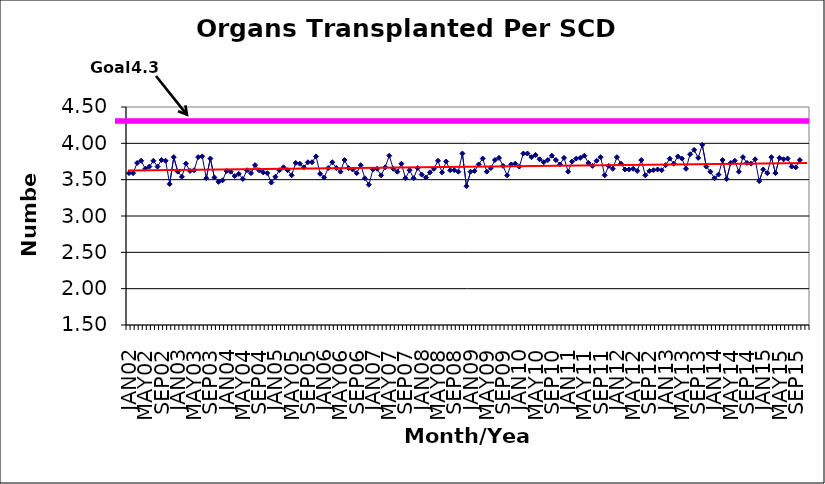
| Category | Series 0 |
|---|---|
| JAN02 | 3.59 |
| FEB02 | 3.59 |
| MAR02 | 3.73 |
| APR02 | 3.76 |
| MAY02 | 3.65 |
| JUN02 | 3.68 |
| JUL02 | 3.76 |
| AUG02 | 3.68 |
| SEP02 | 3.77 |
| OCT02 | 3.76 |
| NOV02 | 3.44 |
| DEC02 | 3.81 |
| JAN03 | 3.61 |
| FEB03 | 3.54 |
| MAR03 | 3.72 |
| APR03 | 3.62 |
| MAY03 | 3.63 |
| JUN03 | 3.81 |
| JUL03 | 3.82 |
| AUG03 | 3.52 |
| SEP03 | 3.79 |
| OCT03 | 3.53 |
| NOV03 | 3.47 |
| DEC03 | 3.49 |
| JAN04 | 3.62 |
| FEB04 | 3.61 |
| MAR04 | 3.55 |
| APR04 | 3.58 |
| MAY04 | 3.51 |
| JUN04 | 3.63 |
| JUL04 | 3.59 |
| AUG04 | 3.7 |
| SEP04 | 3.63 |
| OCT04 | 3.6 |
| NOV04 | 3.59 |
| DEC04 | 3.46 |
| JAN05 | 3.54 |
| FEB05 | 3.63 |
| MAR05 | 3.67 |
| APR05 | 3.63 |
| MAY05 | 3.56 |
| JUN05 | 3.73 |
| JUL05 | 3.72 |
| AUG05 | 3.67 |
| SEP05 | 3.74 |
| OCT05 | 3.74 |
| NOV05 | 3.82 |
| DEC05 | 3.58 |
| JAN06 | 3.53 |
| FEB06 | 3.66 |
| MAR06 | 3.74 |
| APR06 | 3.66 |
| MAY06 | 3.61 |
| JUN06 | 3.77 |
| JUL06 | 3.66 |
| AUG06 | 3.64 |
| SEP06 | 3.59 |
| OCT06 | 3.7 |
| NOV06 | 3.52 |
| DEC06 | 3.43 |
| JAN07 | 3.64 |
| FEB07 | 3.65 |
| MAR07 | 3.56 |
| APR07 | 3.67 |
| MAY07 | 3.83 |
| JUN07 | 3.65 |
| JUL07 | 3.61 |
| AUG07 | 3.72 |
| SEP07 | 3.52 |
| OCT07 | 3.63 |
| NOV07 | 3.52 |
| DEC07 | 3.66 |
| JAN08 | 3.57 |
| FEB08 | 3.53 |
| MAR08 | 3.6 |
| APR08 | 3.65 |
| MAY08 | 3.76 |
| JUN08 | 3.6 |
| JUL08 | 3.75 |
| AUG08 | 3.63 |
| SEP08 | 3.63 |
| OCT08 | 3.61 |
| NOV08 | 3.86 |
| DEC08 | 3.41 |
| JAN09 | 3.61 |
| FEB09 | 3.62 |
| MAR09 | 3.71 |
| APR09 | 3.79 |
| MAY09 | 3.61 |
| JUN09 | 3.66 |
| JUL09 | 3.77 |
| AUG09 | 3.8 |
| SEP09 | 3.69 |
| OCT09 | 3.56 |
| NOV09 | 3.71 |
| DEC09 | 3.72 |
| JAN10 | 3.68 |
| FEB10 | 3.86 |
| MAR10 | 3.86 |
| APR10 | 3.81 |
| MAY10 | 3.84 |
| JUN10 | 3.78 |
| JUL10 | 3.74 |
| AUG10 | 3.77 |
| SEP10 | 3.83 |
| OCT10 | 3.77 |
| NOV10 | 3.71 |
| DEC10 | 3.8 |
| JAN11 | 3.61 |
| FEB11 | 3.75 |
| MAR11 | 3.79 |
| APR11 | 3.8 |
| MAY11 | 3.83 |
| JUN11 | 3.73 |
| JUL11 | 3.69 |
| AUG11 | 3.76 |
| SEP11 | 3.81 |
| OCT11 | 3.56 |
| NOV11 | 3.69 |
| DEC11 | 3.65 |
| JAN12 | 3.81 |
| FEB12 | 3.72 |
| MAR12 | 3.64 |
| APR12 | 3.64 |
| MAY12 | 3.65 |
| JUN12 | 3.62 |
| JUL12 | 3.77 |
| AUG12 | 3.56 |
| SEP12 | 3.62 |
| OCT12 | 3.63 |
| NOV12 | 3.64 |
| DEC12 | 3.63 |
| JAN13 | 3.7 |
| FEB13 | 3.79 |
| MAR13 | 3.72 |
| APR13 | 3.82 |
| MAY13 | 3.79 |
| JUN13 | 3.65 |
| JUL13 | 3.85 |
| AUG13 | 3.91 |
| SEP13 | 3.8 |
| OCT13 | 3.98 |
| NOV13 | 3.68 |
| DEC13 | 3.61 |
| JAN14 | 3.52 |
| FEB14 | 3.57 |
| MAR14 | 3.77 |
| APR14 | 3.51 |
| MAY14 | 3.73 |
| JUN14 | 3.76 |
| JUL14 | 3.61 |
| AUG14 | 3.81 |
| SEP14 | 3.73 |
| OCT14 | 3.72 |
| NOV14 | 3.78 |
| DEC14 | 3.48 |
| JAN15 | 3.64 |
| FEB15 | 3.59 |
| MAR15 | 3.81 |
| APR15 | 3.59 |
| MAY15 | 3.8 |
| JUN15 | 3.78 |
| JUL15 | 3.79 |
| AUG15 | 3.68 |
| SEP15 | 3.67 |
| OCT15 | 3.77 |